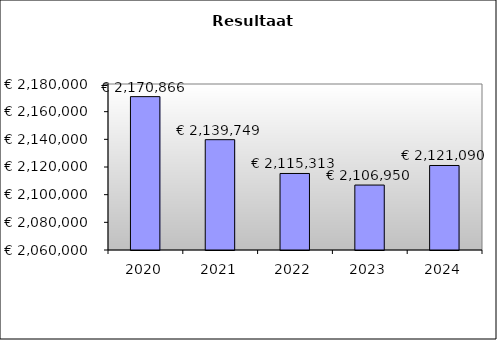
| Category | Series 0 |
|---|---|
| 2020.0 | 2170866.236 |
| 2021.0 | 2139748.931 |
| 2022.0 | 2115312.88 |
| 2023.0 | 2106950.275 |
| 2024.0 | 2121090.495 |